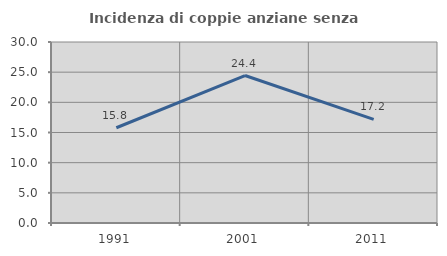
| Category | Incidenza di coppie anziane senza figli  |
|---|---|
| 1991.0 | 15.789 |
| 2001.0 | 24.444 |
| 2011.0 | 17.188 |